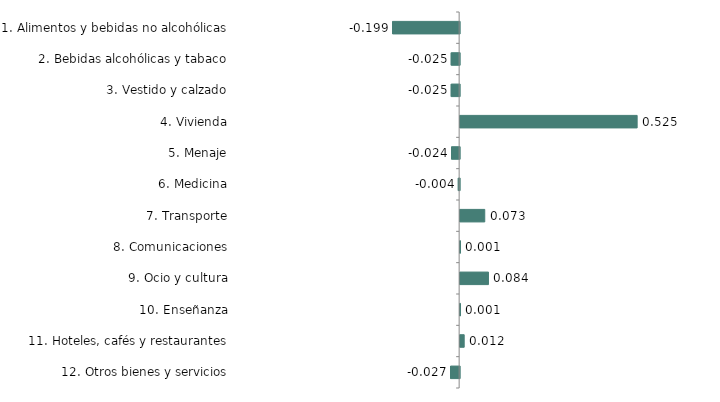
| Category | Series 0 |
|---|---|
| 1. Alimentos y bebidas no alcohólicas | -0.199 |
| 2. Bebidas alcohólicas y tabaco | -0.025 |
| 3. Vestido y calzado | -0.025 |
| 4. Vivienda | 0.525 |
| 5. Menaje | -0.024 |
| 6. Medicina | -0.004 |
| 7. Transporte | 0.073 |
| 8. Comunicaciones | 0.001 |
| 9. Ocio y cultura | 0.084 |
| 10. Enseñanza | 0.001 |
| 11. Hoteles, cafés y restaurantes | 0.012 |
| 12. Otros bienes y servicios | -0.027 |